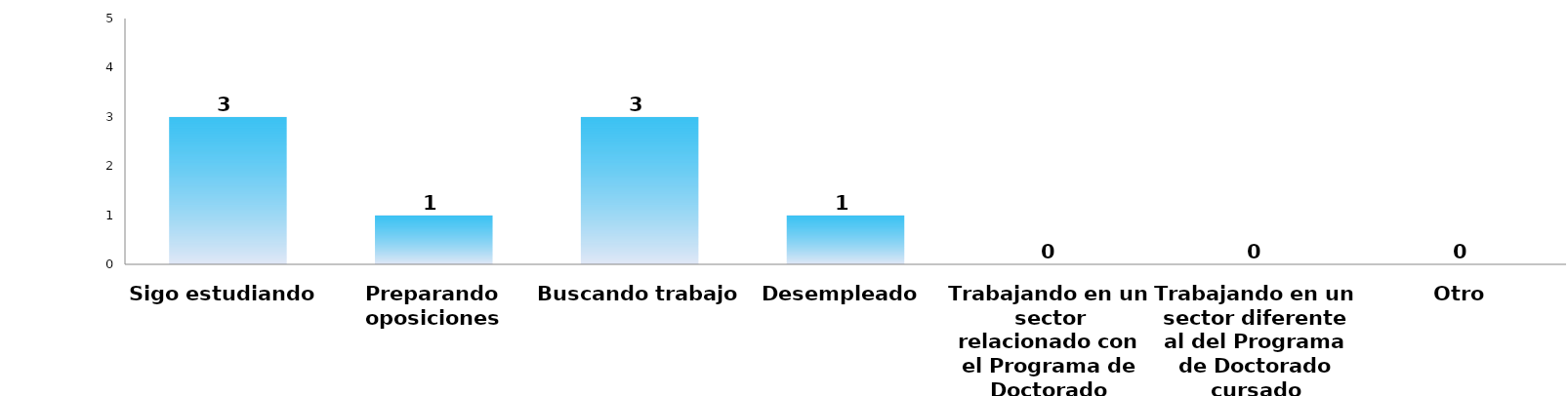
| Category | Series 0 |
|---|---|
| Sigo estudiando | 3 |
| Preparando oposiciones | 1 |
| Buscando trabajo | 3 |
| Desempleado | 1 |
| Trabajando en un sector relacionado con el Programa de Doctorado cursado | 0 |
| Trabajando en un sector diferente al del Programa de Doctorado cursado | 0 |
| Otro | 0 |